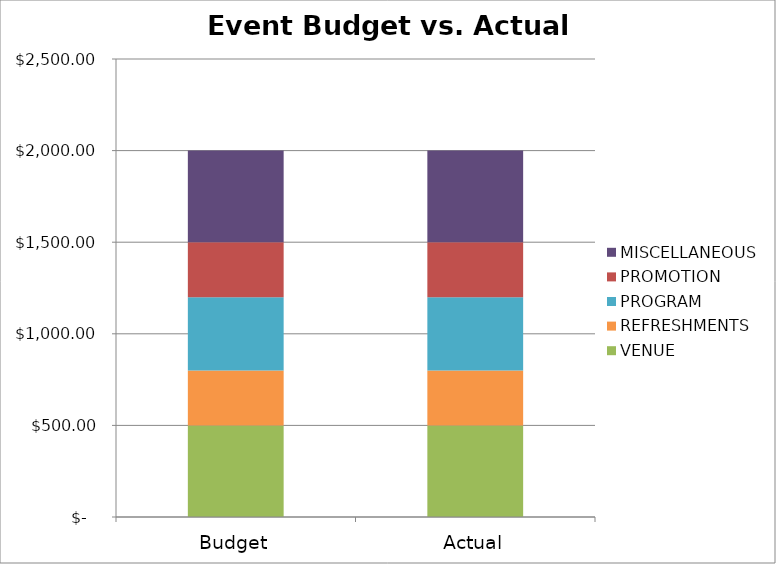
| Category | VENUE | REFRESHMENTS | PROGRAM | PROMOTION | MISCELLANEOUS |
|---|---|---|---|---|---|
| Budget | 500 | 300 | 400 | 300 | 500 |
| Actual | 500 | 300 | 400 | 300 | 500 |